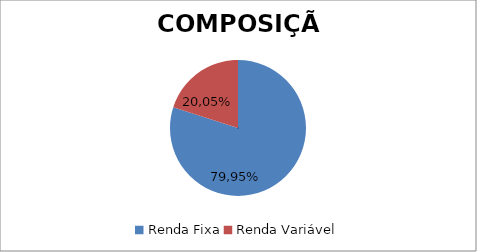
| Category | Series 0 |
|---|---|
| Renda Fixa | 0.799 |
| Renda Variável | 0.201 |